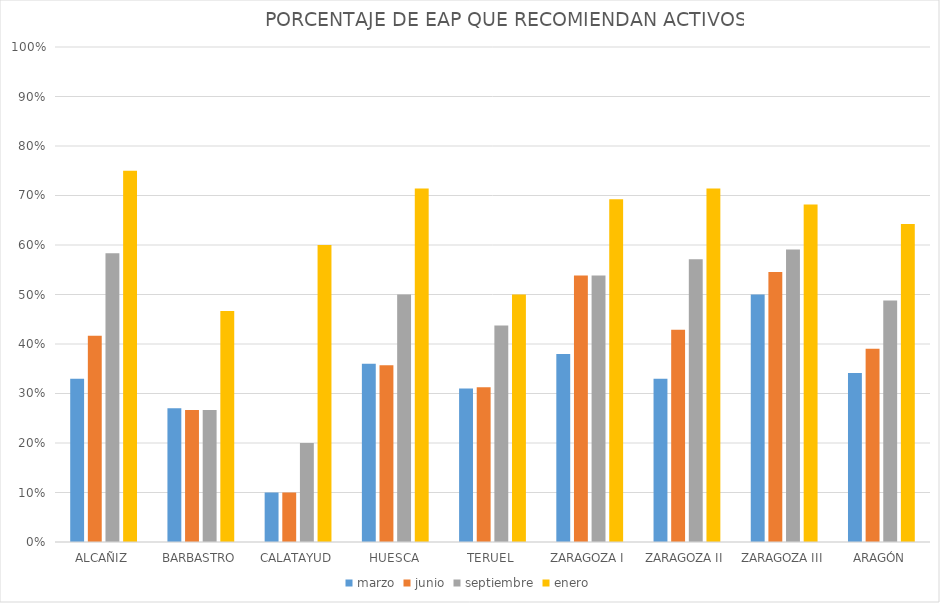
| Category | marzo | junio | septiembre | enero |
|---|---|---|---|---|
| ALCAÑIZ | 0.33 | 0.417 | 0.583 | 0.75 |
| BARBASTRO | 0.27 | 0.267 | 0.267 | 0.467 |
| CALATAYUD | 0.1 | 0.1 | 0.2 | 0.6 |
| HUESCA | 0.36 | 0.357 | 0.5 | 0.714 |
| TERUEL | 0.31 | 0.312 | 0.438 | 0.5 |
| ZARAGOZA I | 0.38 | 0.538 | 0.538 | 0.692 |
| ZARAGOZA II | 0.33 | 0.429 | 0.571 | 0.714 |
| ZARAGOZA III | 0.5 | 0.545 | 0.591 | 0.682 |
| ARAGÓN | 0.341 | 0.39 | 0.488 | 0.642 |